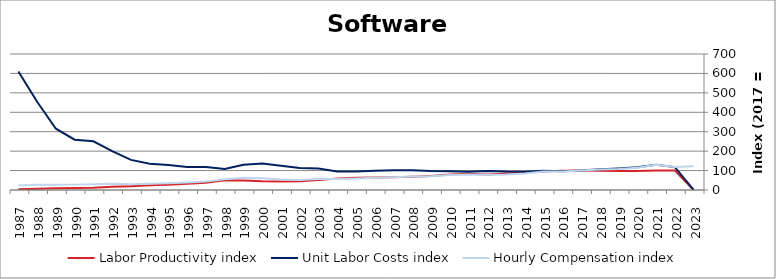
| Category | Labor Productivity index | Unit Labor Costs index | Hourly Compensation index |
|---|---|---|---|
| 2023.0 | 0 | 0 | 122.446 |
| 2022.0 | 100.146 | 117.944 | 118.116 |
| 2021.0 | 99.822 | 129.91 | 129.68 |
| 2020.0 | 97.302 | 117.631 | 114.458 |
| 2019.0 | 97.373 | 111.025 | 108.108 |
| 2018.0 | 99.542 | 106.221 | 105.735 |
| 2017.0 | 100 | 100 | 100 |
| 2016.0 | 99.213 | 96.131 | 95.374 |
| 2015.0 | 95.316 | 99.34 | 94.686 |
| 2014.0 | 90.125 | 94.281 | 84.971 |
| 2013.0 | 84.398 | 94.768 | 79.983 |
| 2012.0 | 79.461 | 98.176 | 78.011 |
| 2011.0 | 84.065 | 94.257 | 79.236 |
| 2010.0 | 79.211 | 96.912 | 76.765 |
| 2009.0 | 72.225 | 97.965 | 70.755 |
| 2008.0 | 67.589 | 101.947 | 68.905 |
| 2007.0 | 65.044 | 101.236 | 65.848 |
| 2006.0 | 63.933 | 98.865 | 63.207 |
| 2005.0 | 62.508 | 95.257 | 59.543 |
| 2004.0 | 59.105 | 95.336 | 56.348 |
| 2003.0 | 50.819 | 110.407 | 56.108 |
| 2002.0 | 45.435 | 113.455 | 51.548 |
| 2001.0 | 43.452 | 124.945 | 54.291 |
| 2000.0 | 44.52 | 136.337 | 60.697 |
| 1999.0 | 48.449 | 129.484 | 62.733 |
| 1998.0 | 50.548 | 108.226 | 54.706 |
| 1997.0 | 37.389 | 118.447 | 44.286 |
| 1996.0 | 32.689 | 118.321 | 38.678 |
| 1995.0 | 27.157 | 129.054 | 35.047 |
| 1994.0 | 24.135 | 134.99 | 32.58 |
| 1993.0 | 19.525 | 154.883 | 30.24 |
| 1992.0 | 16.126 | 199.911 | 32.237 |
| 1991.0 | 11.612 | 250.651 | 29.106 |
| 1990.0 | 10.693 | 258.732 | 27.666 |
| 1989.0 | 8.447 | 315.476 | 26.649 |
| 1988.0 | 6.08 | 454.207 | 27.615 |
| 1987.0 | 3.735 | 610.085 | 22.785 |